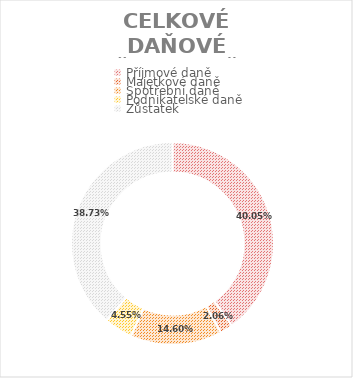
| Category | CELKOVÉ DAŇOVÉ BŘEMENO ČR:  |
|---|---|
| 0 | 0.401 |
| 1 | 0.021 |
| 2 | 0.146 |
| 3 | 0.046 |
| 4 | 0.387 |